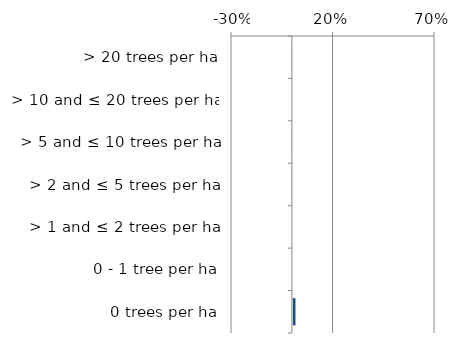
| Category | Near native & fragments |
|---|---|
| 0 trees per ha | 0.015 |
| 0 - 1 tree per ha | 0 |
| > 1 and ≤ 2 trees per ha | 0 |
| > 2 and ≤ 5 trees per ha | 0.001 |
| > 5 and ≤ 10 trees per ha | 0 |
| > 10 and ≤ 20 trees per ha | 0 |
| > 20 trees per ha | 0 |